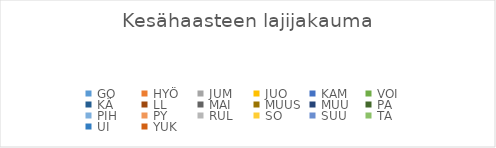
| Category | Series 0 |
|---|---|
| GO | 0 |
| HYÖ | 0 |
| JUM | 0 |
| JUO | 0 |
| KAM | 0 |
| VOI | 0 |
| KÄ | 0 |
| LL | 0 |
| MAI | 0 |
| MUUS | 0 |
| MUU | 0 |
| PA | 0 |
| PIH | 0 |
| PY | 0 |
| RUL | 0 |
| SO | 0 |
| SUU | 0 |
| TA | 0 |
| UI | 0 |
| YUK | 0 |